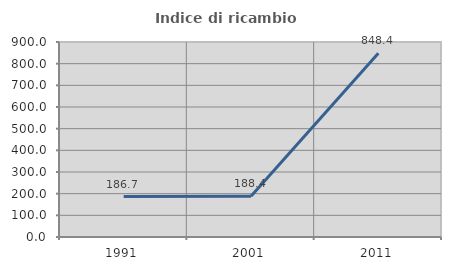
| Category | Indice di ricambio occupazionale  |
|---|---|
| 1991.0 | 186.667 |
| 2001.0 | 188.372 |
| 2011.0 | 848.387 |